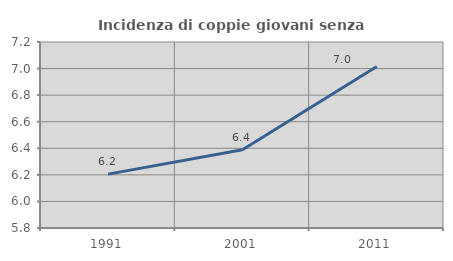
| Category | Incidenza di coppie giovani senza figli |
|---|---|
| 1991.0 | 6.206 |
| 2001.0 | 6.389 |
| 2011.0 | 7.016 |